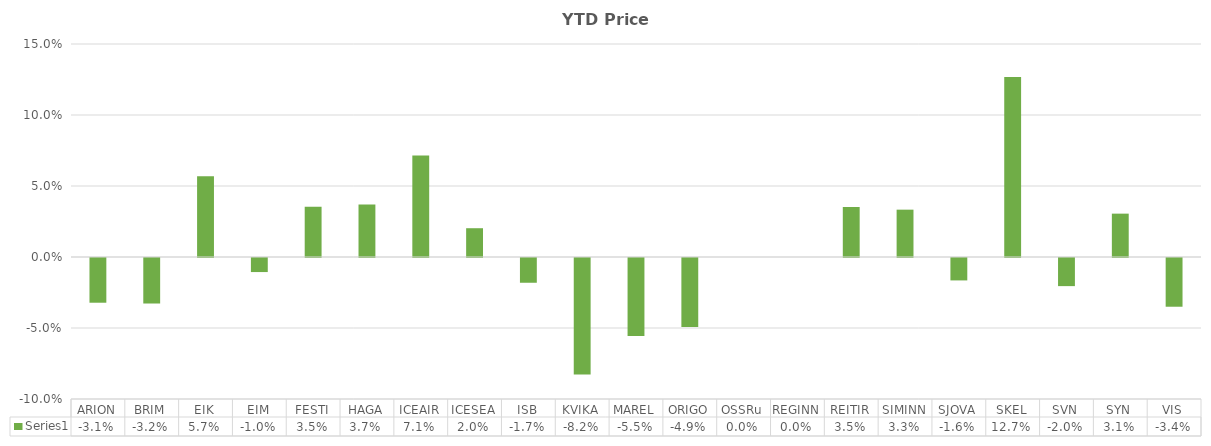
| Category | Series 0 |
|---|---|
| ARION | -0.031 |
| BRIM | -0.032 |
| EIK | 0.057 |
| EIM | -0.01 |
| FESTI | 0.035 |
| HAGA | 0.037 |
| ICEAIR | 0.071 |
| ICESEA | 0.02 |
| ISB | -0.017 |
| KVIKA | -0.082 |
| MAREL | -0.055 |
| ORIGO | -0.049 |
| OSSRu | 0 |
| REGINN | 0 |
| REITIR | 0.035 |
| SIMINN | 0.033 |
| SJOVA | -0.016 |
| SKEL | 0.127 |
| SVN | -0.02 |
| SYN | 0.031 |
| VIS | -0.034 |